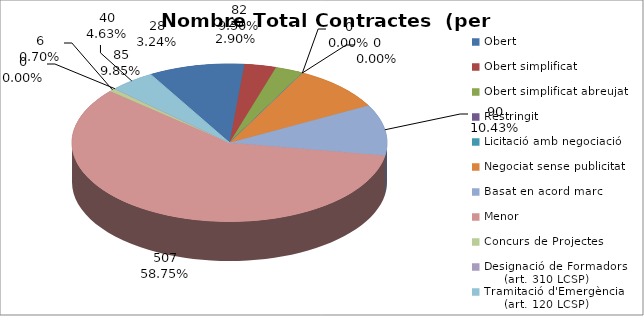
| Category | Nombre Total Contractes |
|---|---|
| Obert | 85 |
| Obert simplificat | 28 |
| Obert simplificat abreujat | 25 |
| Restringit | 0 |
| Licitació amb negociació | 0 |
| Negociat sense publicitat | 82 |
| Basat en acord marc | 90 |
| Menor | 507 |
| Concurs de Projectes | 6 |
| Designació de Formadors
     (art. 310 LCSP) | 0 |
| Tramitació d'Emergència
     (art. 120 LCSP) | 40 |